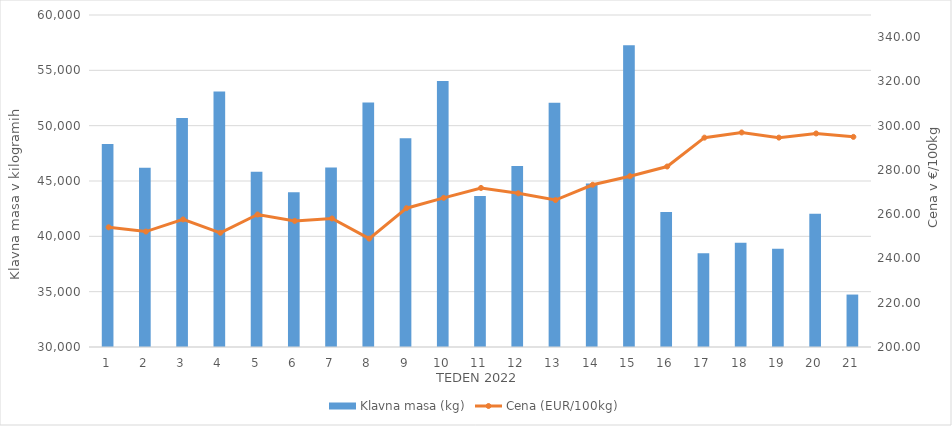
| Category | Klavna masa (kg) |
|---|---|
| 1.0 | 48349 |
| 2.0 | 46187 |
| 3.0 | 50692 |
| 4.0 | 53081 |
| 5.0 | 45844 |
| 6.0 | 43982 |
| 7.0 | 46227 |
| 8.0 | 52099 |
| 9.0 | 48872 |
| 10.0 | 54045 |
| 11.0 | 43645 |
| 12.0 | 46350 |
| 13.0 | 52061 |
| 14.0 | 44774 |
| 15.0 | 57268 |
| 16.0 | 42191 |
| 17.0 | 38469 |
| 18.0 | 39417 |
| 19.0 | 38876 |
| 20.0 | 42047 |
| 21.0 | 34739 |